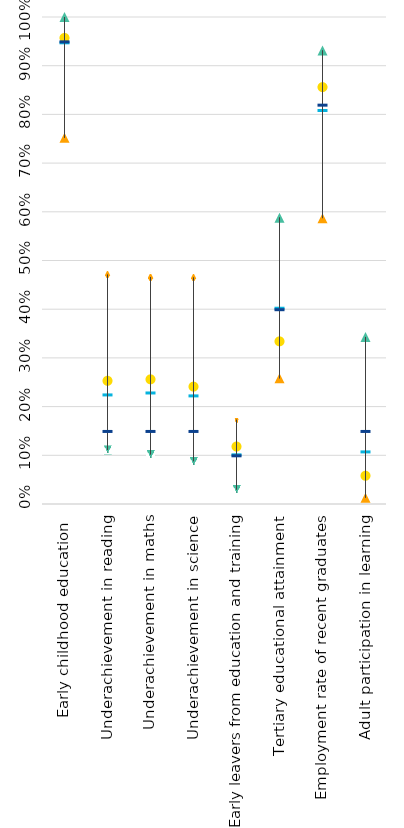
| Category | Hungary | Strongest performer | Weakest performer | EU average | EU target |
|---|---|---|---|---|---|
| Early childhood education  | 0.957 | 1 | 0.752 | 0.948 | 0.95 |
| Underachievement in reading | 0.253 | 0.111 | 0.471 | 0.225 | 0.15 |
| Underachievement in maths | 0.256 | 0.102 | 0.466 | 0.229 | 0.15 |
| Underachievement in science | 0.241 | 0.088 | 0.465 | 0.223 | 0.15 |
| Early leavers from education and training | 0.118 | 0.03 | 0.173 | 0.102 | 0.1 |
| Tertiary educational attainment | 0.334 | 0.588 | 0.258 | 0.403 | 0.4 |
| Employment rate of recent graduates | 0.856 | 0.931 | 0.587 | 0.809 | 0.82 |
| Adult participation in learning | 0.058 | 0.343 | 0.013 | 0.108 | 0.15 |